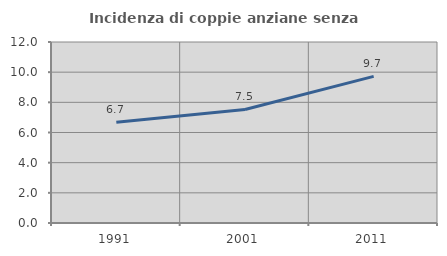
| Category | Incidenza di coppie anziane senza figli  |
|---|---|
| 1991.0 | 6.672 |
| 2001.0 | 7.526 |
| 2011.0 | 9.721 |